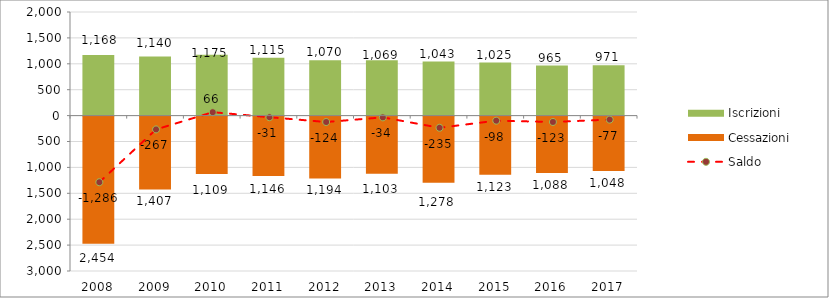
| Category | Iscrizioni | Cessazioni |
|---|---|---|
| 2008.0 | 1168 | -2454 |
| 2009.0 | 1140 | -1407 |
| 2010.0 | 1175 | -1109 |
| 2011.0 | 1115 | -1146 |
| 2012.0 | 1070 | -1194 |
| 2013.0 | 1069 | -1103 |
| 2014.0 | 1043 | -1278 |
| 2015.0 | 1025 | -1123 |
| 2016.0 | 965 | -1088 |
| 2017.0 | 971 | -1048 |